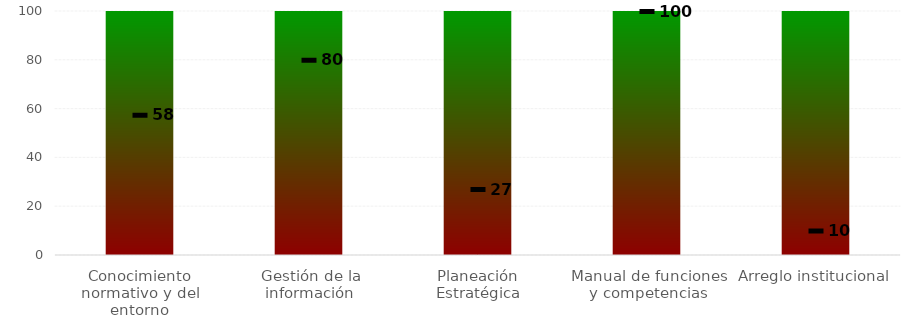
| Category | Niveles |
|---|---|
| Conocimiento normativo y del entorno | 100 |
| Gestión de la información | 100 |
| Planeación Estratégica | 100 |
| Manual de funciones y competencias | 100 |
| Arreglo institucional | 100 |